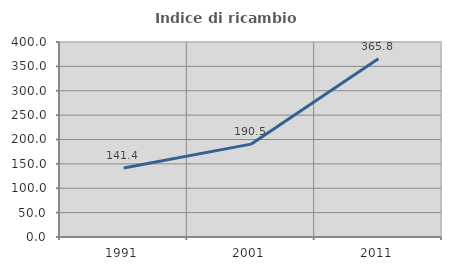
| Category | Indice di ricambio occupazionale  |
|---|---|
| 1991.0 | 141.406 |
| 2001.0 | 190.476 |
| 2011.0 | 365.753 |